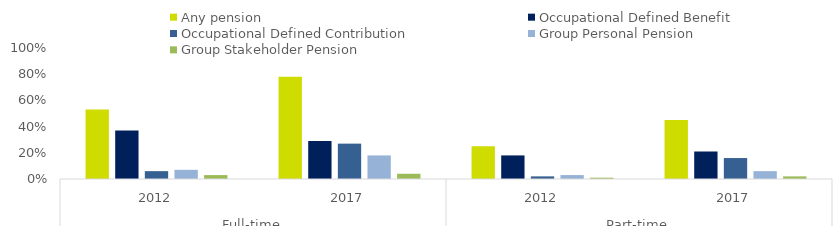
| Category | Any pension | Occupational Defined Benefit | Occupational Defined Contribution | Group Personal Pension | Group Stakeholder Pension |
|---|---|---|---|---|---|
| 0 | 0.53 | 0.37 | 0.06 | 0.07 | 0.03 |
| 1 | 0.78 | 0.29 | 0.27 | 0.18 | 0.04 |
| 2 | 0.25 | 0.18 | 0.02 | 0.03 | 0.01 |
| 3 | 0.45 | 0.21 | 0.16 | 0.06 | 0.02 |